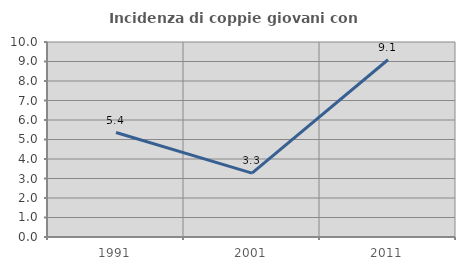
| Category | Incidenza di coppie giovani con figli |
|---|---|
| 1991.0 | 5.357 |
| 2001.0 | 3.279 |
| 2011.0 | 9.091 |